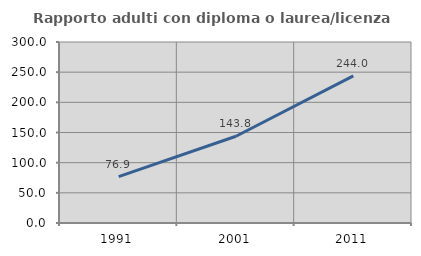
| Category | Rapporto adulti con diploma o laurea/licenza media  |
|---|---|
| 1991.0 | 76.884 |
| 2001.0 | 143.819 |
| 2011.0 | 243.983 |